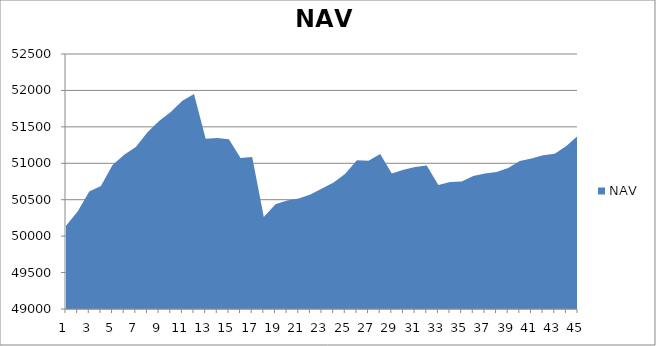
| Category | NAV |
|---|---|
| 0 | 50142.343 |
| 1 | 50336.57 |
| 2 | 50612.255 |
| 3 | 50687.913 |
| 4 | 50975.413 |
| 5 | 51115.874 |
| 6 | 51223.542 |
| 7 | 51427.364 |
| 8 | 51580.567 |
| 9 | 51704.692 |
| 10 | 51858.016 |
| 11 | 51951.766 |
| 12 | 51336.067 |
| 13 | 51345.356 |
| 14 | 51328.667 |
| 15 | 51072.985 |
| 16 | 51085.199 |
| 17 | 50261.67 |
| 18 | 50438.394 |
| 19 | 50489.896 |
| 20 | 50518.251 |
| 21 | 50572.468 |
| 22 | 50655.55 |
| 23 | 50737.787 |
| 24 | 50856.035 |
| 25 | 51041.806 |
| 26 | 51034.925 |
| 27 | 51128.589 |
| 28 | 50859.456 |
| 29 | 50911.137 |
| 30 | 50950.007 |
| 31 | 50970.175 |
| 32 | 50701.326 |
| 33 | 50743.495 |
| 34 | 50751.546 |
| 35 | 50826.725 |
| 36 | 50860.533 |
| 37 | 50879.283 |
| 38 | 50936.644 |
| 39 | 51031.381 |
| 40 | 51065.306 |
| 41 | 51109.987 |
| 42 | 51132.251 |
| 43 | 51238.242 |
| 44 | 51380.786 |